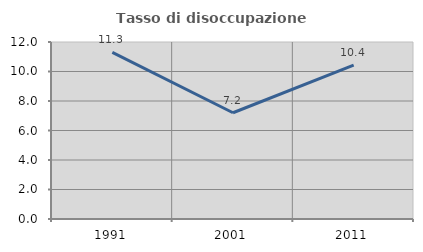
| Category | Tasso di disoccupazione giovanile  |
|---|---|
| 1991.0 | 11.296 |
| 2001.0 | 7.205 |
| 2011.0 | 10.432 |